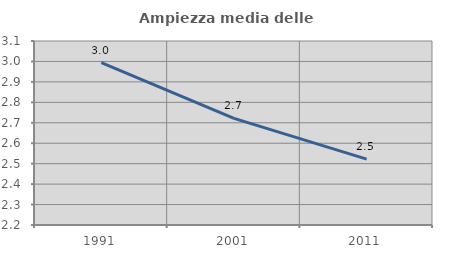
| Category | Ampiezza media delle famiglie |
|---|---|
| 1991.0 | 2.994 |
| 2001.0 | 2.722 |
| 2011.0 | 2.522 |